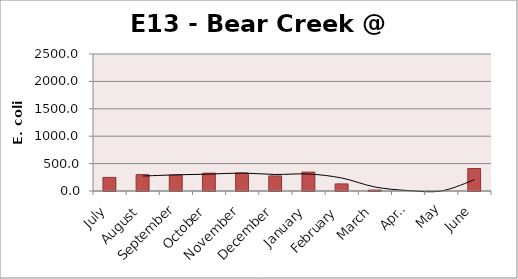
| Category | E. coli MPN |
|---|---|
| July | 248.1 |
| August | 298.7 |
| September | 290.9 |
| October | 325.5 |
| November | 328.2 |
| December | 275.5 |
| January | 344.8 |
| February | 129.6 |
| March | 17.1 |
| April | 0 |
| May | 0 |
| June | 410.6 |